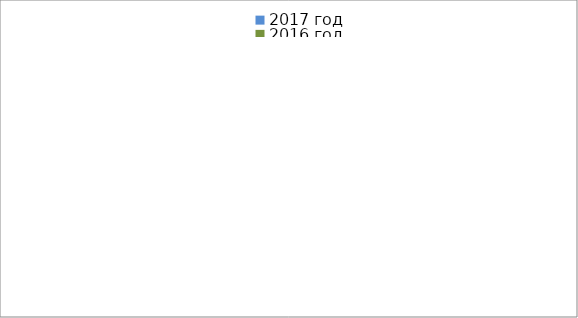
| Category | 2017 год | 2016 год |
|---|---|---|
|  - поджог | 3 | 20 |
|  - неосторожное обращение с огнём | 1 | 14 |
|  - НПТЭ электрооборудования | 5 | 2 |
|  - НПУ и Э печей | 16 | 16 |
|  - НПУ и Э транспортных средств | 24 | 9 |
|   -Шалость с огнем детей | 2 | 3 |
|  -НППБ при эксплуатации эл.приборов | 13 | 4 |
|  - курение | 15 | 2 |
| - прочие | 28 | 35 |
| - не установленные причины | 0 | 11 |